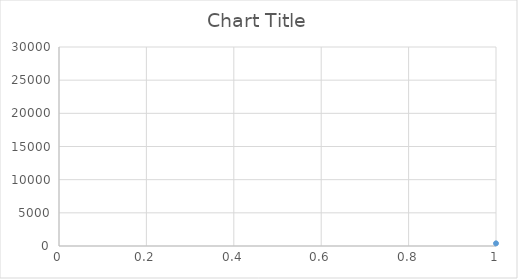
| Category | Series 0 |
|---|---|
| 0 | 398 |
| 1 | 389 |
| 2 | 937 |
| 3 | 1243 |
| 4 | 1177 |
| 5 | 1186 |
| 6 | 1830 |
| 7 | 2538 |
| 8 | 2868 |
| 9 | 2274 |
| 10 | 2139 |
| 11 | 2296 |
| 12 | 2397 |
| 13 | 2894 |
| 14 | 4419 |
| 15 | 4913 |
| 16 | 3732 |
| 17 | 3227 |
| 18 | 2649 |
| 19 | 2783 |
| 20 | 4714 |
| 21 | 5340 |
| 22 | 2962 |
| 23 | 4725 |
| 24 | 4159 |
| 25 | 4694 |
| 26 | 5621 |
| 27 | 6539 |
| 28 | 13296 |
| 29 | 13918 |
| 30 | 16278 |
| 31 | 15436 |
| 32 | 16320 |
| 33 | 17171 |
| 34 | 17580 |
| 35 | 17172 |
| 36 | 16459 |
| 37 | 15209 |
| 38 | 15559 |
| 39 | 19782 |
| 40 | 20420 |
| 41 | 15287 |
| 42 | 17844 |
| 43 | 19141 |
| 44 | 18852 |
| 45 | 13702 |
| 46 | 16472 |
| 47 | 14805 |
| 48 | 18462 |
| 49 | 18004 |
| 50 | 19324 |
| 51 | 22596 |
| 52 | 17443 |
| 53 | 17538 |
| 54 | 17333 |
| 55 | 18366 |
| 56 | 16692 |
| 57 | 15156 |
| 58 | 16122 |
| 59 | 15944 |
| 60 | 17195 |
| 61 | 20767 |
| 62 | 15975 |
| 63 | 17808 |
| 64 | 28422 |
| 65 | 26509 |
| 66 | 18009 |
| 67 | 23143 |
| 68 | 22014 |
| 69 | 22864 |
| 70 | 22418 |
| 71 | 19370 |
| 72 | 19412 |
| 73 | 20563 |
| 74 | 20166 |
| 75 | 14914 |
| 76 | 14748 |
| 77 | 13690 |
| 78 | 7410 |
| 79 | 16703 |
| 80 | 14364 |
| 81 | 16595 |
| 82 | 17082 |
| 83 | 13503 |
| 84 | 15510 |
| 85 | 15129 |
| 86 | 7592 |
| 87 | 14618 |
| 88 | 11691 |
| 89 | 12754 |
| 90 | 9172 |
| 91 | 13881 |
| 92 | 12123 |
| 93 | 15198 |
| 94 | 12115 |
| 95 | 12960 |
| 96 | 14405 |
| 97 | 13683 |
| 98 | 9507 |
| 99 | 12339 |
| 100 | 11687 |
| 101 | 12864 |
| 102 | 10977 |
| 103 | 15879 |
| 104 | 13991 |
| 105 | 14014 |
| 106 | 14358 |
| 107 | 13717 |
| 108 | 12727 |
| 109 | 10805 |
| 110 | 8692 |
| 111 | 11821 |
| 112 | 11037 |
| 113 | 12828 |
| 114 | 9671 |
| 115 | 8775 |
| 116 | 13686 |
| 117 | 12669 |
| 118 | 12901 |
| 119 | 13277 |
| 120 | 11891 |
| 121 | 10434 |
| 122 | 9929 |
| 123 | 11121 |
| 124 | 13575 |
| 125 | 13826 |
| 126 | 8434 |
| 127 | 8870 |
| 128 | 5038 |
| 129 | 9120 |
| 130 | 3921 |
| 131 | 4455 |
| 132 | 3325 |
| 133 | 4325 |
| 134 | 8255 |
| 135 | 10158 |
| 136 | 12924 |
| 137 | 13181 |
| 138 | 9956 |
| 139 | 7391 |
| 140 | 5654 |
| 141 | 5311 |
| 142 | 7553 |
| 143 | 5156 |
| 144 | 5784 |
| 145 | 9503 |
| 146 | 12468 |
| 147 | 12244 |
| 148 | 13264 |
| 149 | 12062 |
| 150 | 7841 |
| 151 | 11779 |
| 152 | 12183 |
| 153 | 7977 |
| 154 | 7675 |
| 155 | 7903 |
| 156 | 8870 |
| 157 | 11782 |
| 158 | 13370 |
| 159 | 11572 |
| 160 | 10529 |
| 161 | 9435 |
| 162 | 8238 |
| 163 | 6082 |
| 164 | 3953 |
| 165 | 3336 |
| 166 | 3036 |
| 167 | 2940 |
| 168 | 2922 |
| 169 | 5112 |
| 170 | 7554 |
| 171 | 12821 |
| 172 | 15023 |
| 173 | 11428 |
| 174 | 7876 |
| 175 | 6091 |
| 176 | 4382 |
| 177 | 3440 |
| 178 | 2985 |
| 179 | 3182 |
| 180 | 3157 |
| 181 | 5121 |
| 182 | 7272 |
| 183 | 9616 |
| 184 | 11282 |
| 185 | 11390 |
| 186 | 5660 |
| 187 | 4827 |
| 188 | 3149 |
| 189 | 2993 |
| 190 | 2507 |
| 191 | 2700 |
| 192 | 2765 |
| 193 | 4696 |
| 194 | 9598 |
| 195 | 10016 |
| 196 | 12387 |
| 197 | 11932 |
| 198 | 11006 |
| 199 | 6546 |
| 200 | 3499 |
| 201 | 2941 |
| 202 | 2194 |
| 203 | 2358 |
| 204 | 2348 |
| 205 | 3953 |
| 206 | 7945 |
| 207 | 11380 |
| 208 | 14910 |
| 209 | 13807 |
| 210 | 9798 |
| 211 | 6551 |
| 212 | 3608 |
| 213 | 2971 |
| 214 | 3098 |
| 215 | 3339 |
| 216 | 2992 |
| 217 | 4004 |
| 218 | 9872 |
| 219 | 9836 |
| 220 | 13325 |
| 221 | 12732 |
| 222 | 7943 |
| 223 | 4720 |
| 224 | 3321 |
| 225 | 2983 |
| 226 | 2840 |
| 227 | 2990 |
| 228 | 3016 |
| 229 | 3479 |
| 230 | 6858 |
| 231 | 6727 |
| 232 | 12905 |
| 233 | 9311 |
| 234 | 6974 |
| 235 | 6139 |
| 236 | 3397 |
| 237 | 2585 |
| 238 | 2866 |
| 239 | 2353 |
| 240 | 2386 |
| 241 | 3304 |
| 242 | 5206 |
| 243 | 10295 |
| 244 | 10663 |
| 245 | 9839 |
| 246 | 7399 |
| 247 | 4358 |
| 248 | 2444 |
| 249 | 2552 |
| 250 | 2382 |
| 251 | 2488 |
| 252 | 2074 |
| 253 | 3079 |
| 254 | 6794 |
| 255 | 9433 |
| 256 | 11632 |
| 257 | 9367 |
| 258 | 8729 |
| 259 | 7024 |
| 260 | 2845 |
| 261 | 1974 |
| 262 | 2426 |
| 263 | 2330 |
| 264 | 2640 |
| 265 | 3804 |
| 266 | 8728 |
| 267 | 10667 |